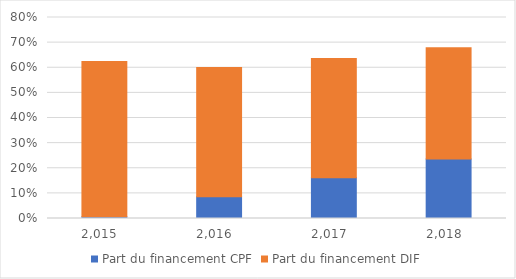
| Category | Part du financement CPF | Part du financement DIF |
|---|---|---|
| 2015.0 | 0.007 | 0.619 |
| 2016.0 | 0.087 | 0.514 |
| 2017.0 | 0.162 | 0.475 |
| 2018.0 | 0.237 | 0.443 |